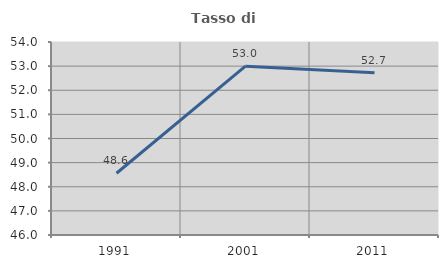
| Category | Tasso di occupazione   |
|---|---|
| 1991.0 | 48.56 |
| 2001.0 | 52.998 |
| 2011.0 | 52.722 |